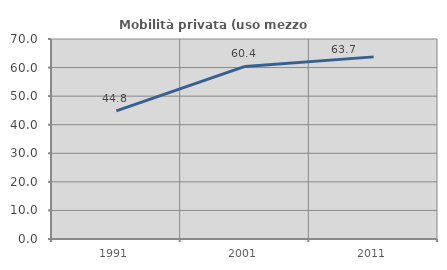
| Category | Mobilità privata (uso mezzo privato) |
|---|---|
| 1991.0 | 44.843 |
| 2001.0 | 60.39 |
| 2011.0 | 63.745 |